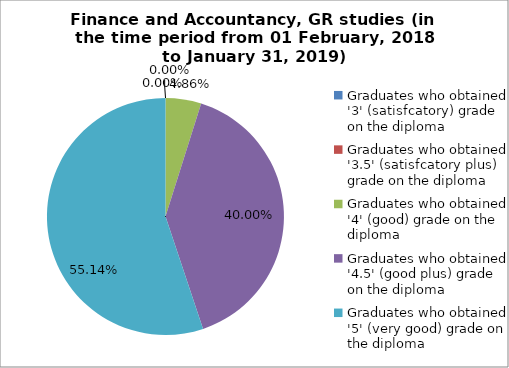
| Category | Series 1 |
|---|---|
| Graduates who obtained '3' (satisfcatory) grade on the diploma | 0 |
| Graduates who obtained '3.5' (satisfcatory plus) grade on the diploma | 0 |
| Graduates who obtained '4' (good) grade on the diploma | 4.865 |
| Graduates who obtained '4.5' (good plus) grade on the diploma | 40 |
| Graduates who obtained '5' (very good) grade on the diploma | 55.135 |